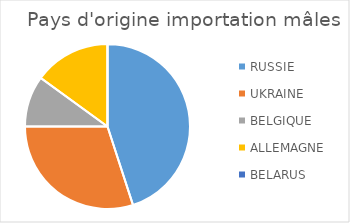
| Category | Series 0 |
|---|---|
| RUSSIE | 9 |
| UKRAINE | 6 |
| BELGIQUE | 2 |
| ALLEMAGNE | 3 |
| BELARUS | 0 |